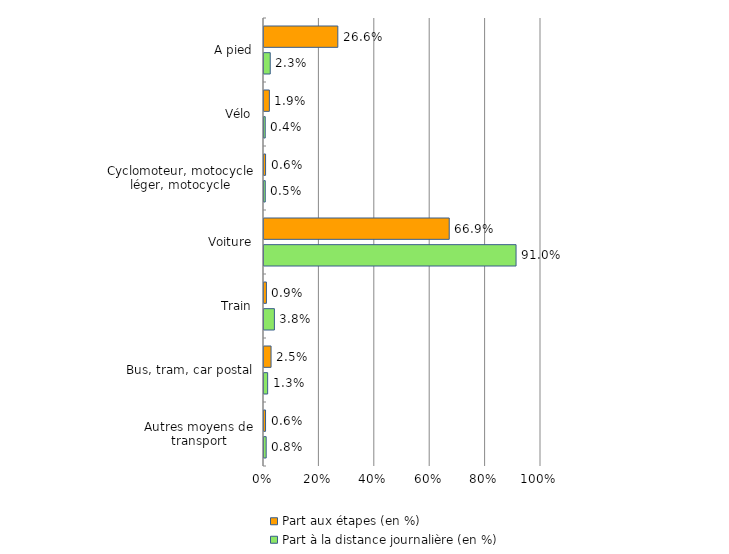
| Category | Part aux étapes (en %) | Part à la distance journalière (en %) |
|---|---|---|
| A pied | 26.649 | 2.256 |
| Vélo | 1.936 | 0.444 |
| Cyclomoteur, motocycle léger, motocycle | 0.569 | 0.457 |
| Voiture | 66.868 | 90.992 |
| Train | 0.875 | 3.752 |
| Bus, tram, car postal | 2.547 | 1.314 |
| Autres moyens de transport | 0.556 | 0.785 |